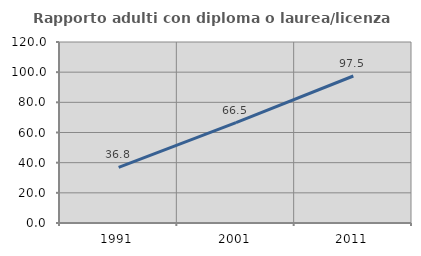
| Category | Rapporto adulti con diploma o laurea/licenza media  |
|---|---|
| 1991.0 | 36.826 |
| 2001.0 | 66.492 |
| 2011.0 | 97.451 |